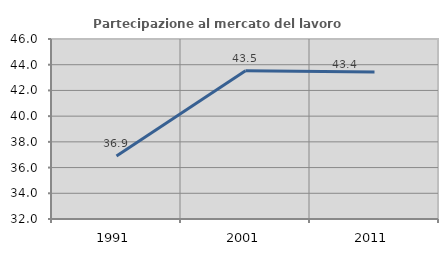
| Category | Partecipazione al mercato del lavoro  femminile |
|---|---|
| 1991.0 | 36.897 |
| 2001.0 | 43.529 |
| 2011.0 | 43.443 |